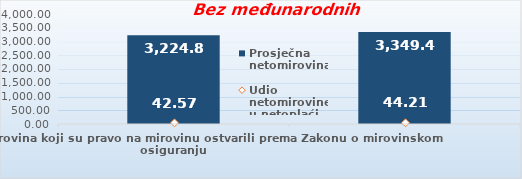
| Category | Prosječna netomirovina  |
|---|---|
| Korisnici mirovina koji su pravo na mirovinu ostvarili prema Zakonu o mirovinskom osiguranju  | 3224.88 |
| Korisnici koji su pravo na mirovinu PRVI PUT ostvarili u 2022. godini prema Zakonu o mirovinskom osiguranju - NOVI KORISNICI | 3349.469 |